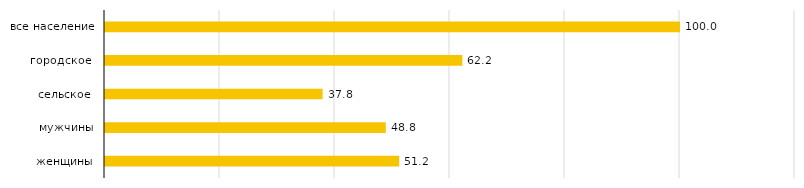
| Category | Series 0 |
|---|---|
| женщины | 51.164 |
| мужчины | 48.836 |
| сельское  | 37.849 |
| городское  | 62.151 |
| все население | 100 |